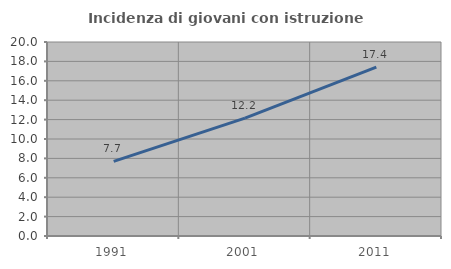
| Category | Incidenza di giovani con istruzione universitaria |
|---|---|
| 1991.0 | 7.692 |
| 2001.0 | 12.155 |
| 2011.0 | 17.419 |